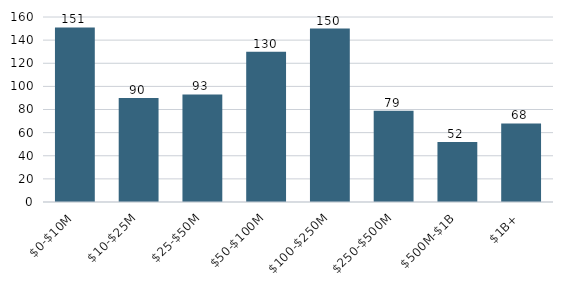
| Category | Firm Count |
|---|---|
| $0-$10M | 151 |
| $10-$25M | 90 |
| $25-$50M | 93 |
| $50-$100M | 130 |
| $100-$250M | 150 |
| $250-$500M | 79 |
| $500M-$1B | 52 |
| $1B+ | 68 |